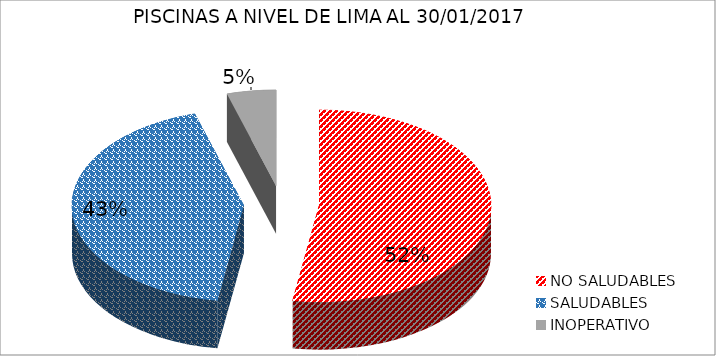
| Category | N.° | PORCENTAJE (%) |
|---|---|---|
| NO SALUDABLES | 182 | 0.52 |
| SALUDABLES | 149 | 0.43 |
| INOPERATIVO | 16 | 0.05 |